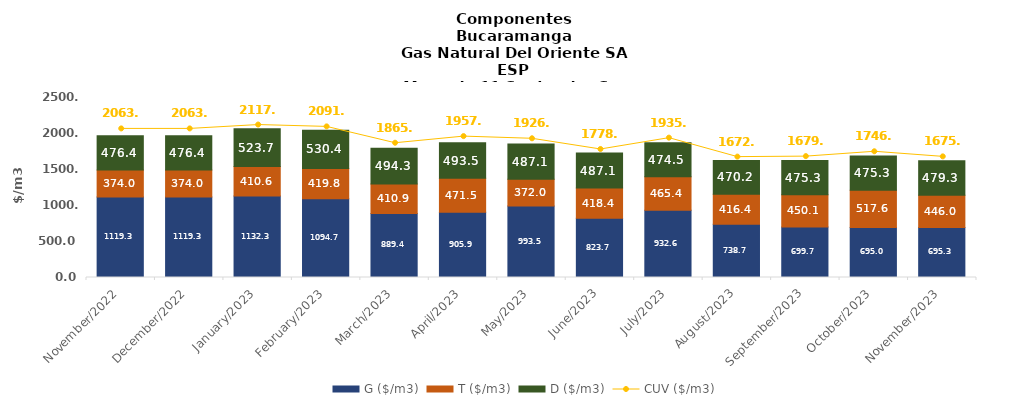
| Category | G ($/m3) | T ($/m3) | D ($/m3) |
|---|---|---|---|
| 2022-11-01 | 1119.25 | 374.03 | 476.36 |
| 2022-12-01 | 1119.25 | 374.03 | 476.36 |
| 2023-01-01 | 1132.3 | 410.55 | 523.74 |
| 2023-02-01 | 1094.71 | 419.79 | 530.39 |
| 2023-03-01 | 889.39 | 410.92 | 494.25 |
| 2023-04-01 | 905.91 | 471.46 | 493.54 |
| 2023-05-01 | 993.53 | 372.04 | 487.06 |
| 2023-06-01 | 823.66 | 418.43 | 487.06 |
| 2023-07-01 | 932.63 | 465.37 | 474.47 |
| 2023-08-01 | 738.7 | 416.42 | 470.2 |
| 2023-09-01 | 699.68 | 450.11 | 475.33 |
| 2023-10-01 | 694.96 | 517.63 | 475.33 |
| 2023-11-01 | 695.28 | 446.03 | 479.27 |